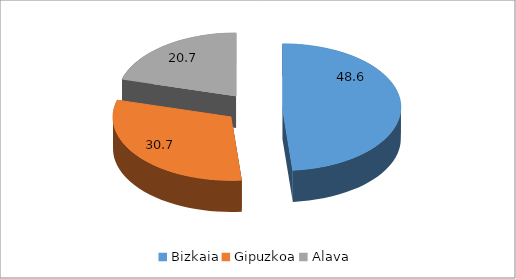
| Category | Series 0 |
|---|---|
| Bizkaia | 48.6 |
| Gipuzkoa | 30.7 |
| Alava | 20.7 |